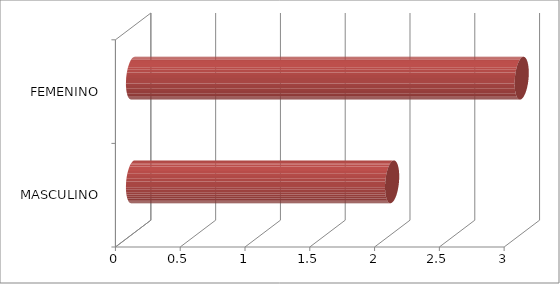
| Category | Series 0 |
|---|---|
| MASCULINO | 2 |
| FEMENINO | 3 |